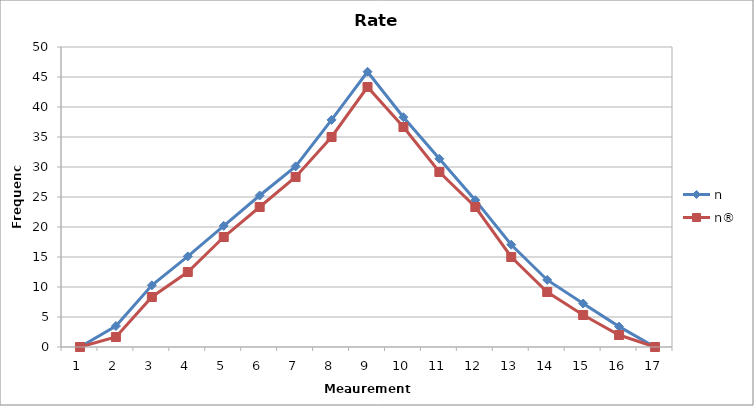
| Category | n | n® |
|---|---|---|
| 0 | 0 | 0 |
| 1 | 3.5 | 1.667 |
| 2 | 10.275 | 8.333 |
| 3 | 15.1 | 12.5 |
| 4 | 20.2 | 18.333 |
| 5 | 25.25 | 23.333 |
| 6 | 30.1 | 28.333 |
| 7 | 37.85 | 35 |
| 8 | 45.875 | 43.333 |
| 9 | 38.3 | 36.667 |
| 10 | 31.375 | 29.167 |
| 11 | 24.47 | 23.333 |
| 12 | 17.05 | 15 |
| 13 | 11.175 | 9.167 |
| 14 | 7.25 | 5.333 |
| 15 | 3.4 | 2 |
| 16 | 0 | 0 |